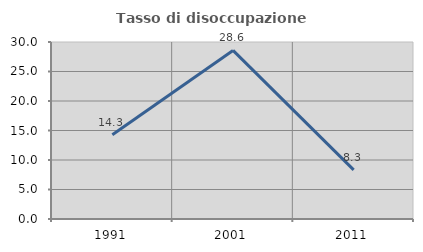
| Category | Tasso di disoccupazione giovanile  |
|---|---|
| 1991.0 | 14.286 |
| 2001.0 | 28.571 |
| 2011.0 | 8.333 |